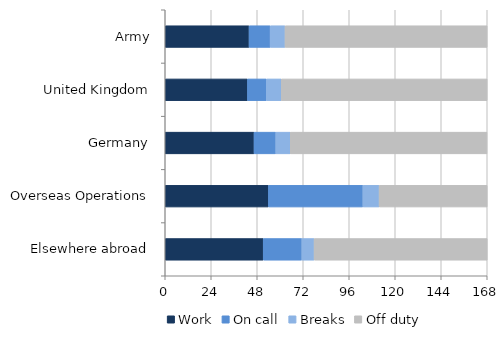
| Category | Work | On call | Breaks | Off duty |
|---|---|---|---|---|
| Army | 43.744 | 11.005 | 7.77 | 105.444 |
| United Kingdom | 42.919 | 9.791 | 7.851 | 107.408 |
| Germany | 46.347 | 11.323 | 7.562 | 102.645 |
| Overseas Operations | 53.849 | 49.287 | 8.47 | 56.388 |
| Elsewhere abroad | 51.119 | 20.156 | 6.411 | 90.325 |